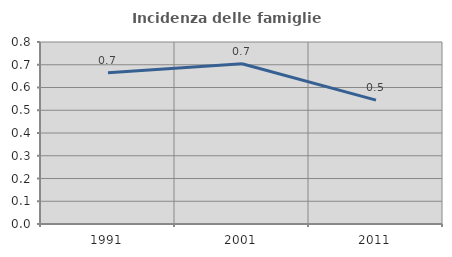
| Category | Incidenza delle famiglie numerose |
|---|---|
| 1991.0 | 0.664 |
| 2001.0 | 0.704 |
| 2011.0 | 0.544 |